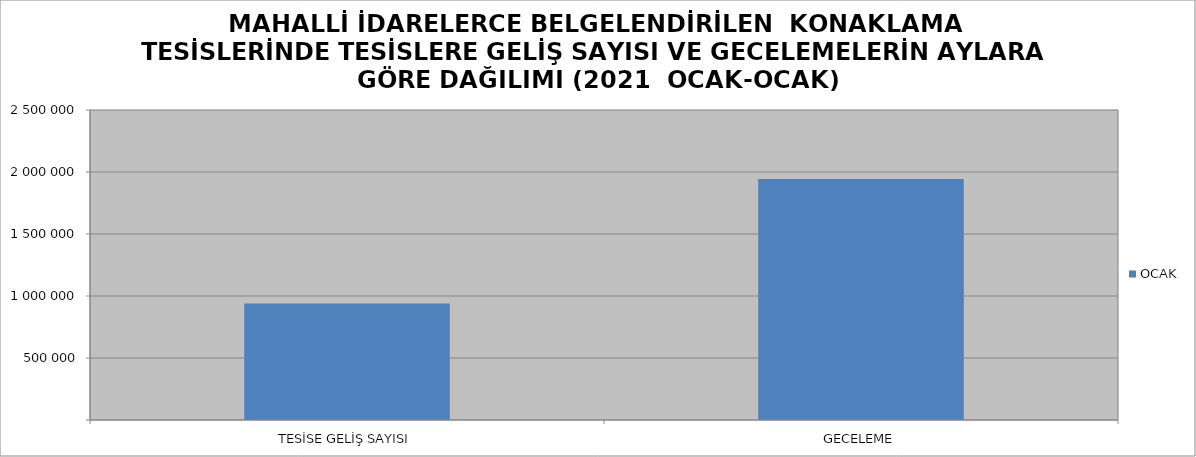
| Category | OCAK |
|---|---|
| TESİSE GELİŞ SAYISI | 940331 |
| GECELEME | 1943007 |